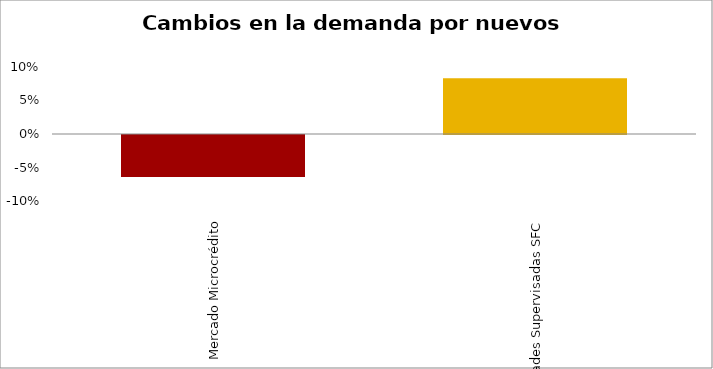
| Category | Microcrédito |
|---|---|
| Mercado Microcrédito | -0.062 |
| Entidades Supervisadas SFC | 0.083 |